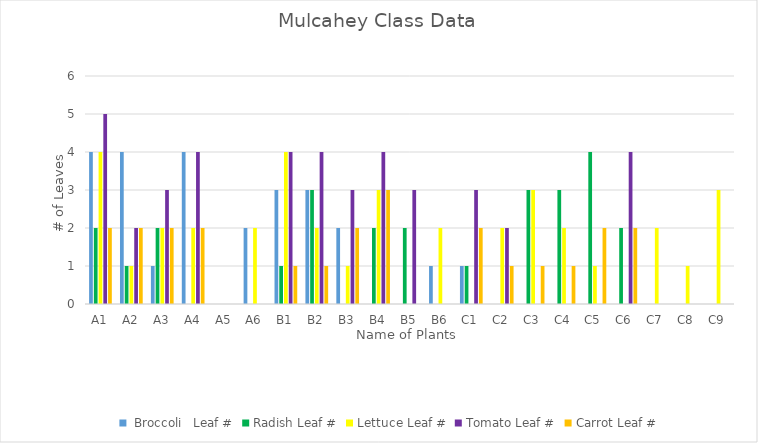
| Category |  Broccoli   | Radish | Lettuce | Tomato | Carrot |
|---|---|---|---|---|---|
| A1 | 4 | 2 | 4 | 5 | 2 |
| A2 | 4 | 1 | 1 | 2 | 2 |
| A3 | 1 | 2 | 2 | 3 | 2 |
| A4 | 4 | 0 | 2 | 4 | 2 |
| A5 | 0 | 0 | 0 | 0 | 0 |
| A6 | 2 | 0 | 2 | 0 | 0 |
| B1 | 3 | 1 | 4 | 4 | 1 |
| B2 | 3 | 3 | 2 | 4 | 1 |
| B3 | 2 | 0 | 1 | 3 | 2 |
| B4 | 0 | 2 | 3 | 4 | 3 |
| B5 | 0 | 2 | 0 | 3 | 0 |
| B6 | 1 | 0 | 2 | 0 | 0 |
| C1 | 1 | 1 | 0 | 3 | 2 |
| C2 | 0 | 0 | 2 | 2 | 1 |
| C3 | 0 | 3 | 3 | 0 | 1 |
| C4 | 0 | 3 | 2 | 0 | 1 |
| C5 | 0 | 4 | 1 | 0 | 2 |
| C6 | 0 | 2 | 0 | 4 | 2 |
| C7 | 0 | 0 | 2 | 0 | 0 |
| C8 | 0 | 0 | 1 | 0 | 0 |
| C9 | 0 | 0 | 3 | 0 | 0 |